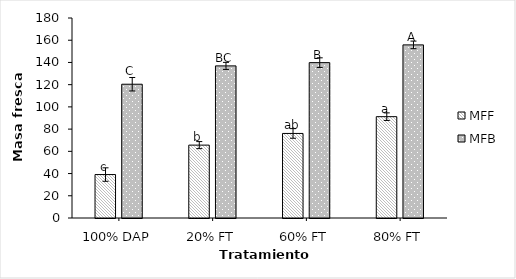
| Category | MFF | MFB |
|---|---|---|
| 100% DAP | 39.1 | 120.4 |
| 20% FT | 65.6 | 136.9 |
| 60% FT | 76.1 | 139.833 |
| 80% FT | 91.2 | 155.8 |